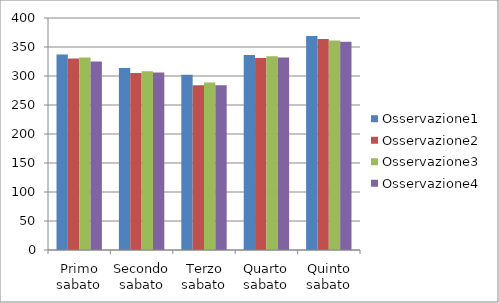
| Category | Osservazione1 | Osservazione2 | Osservazione3 | Osservazione4 |
|---|---|---|---|---|
| Primo sabato | 337 | 330 | 332 | 325 |
| Secondo sabato | 314 | 305 | 308 | 306 |
| Terzo sabato | 302 | 284 | 289 | 284 |
| Quarto sabato | 336 | 331 | 334 | 332 |
| Quinto sabato | 369 | 364 | 361 | 359 |